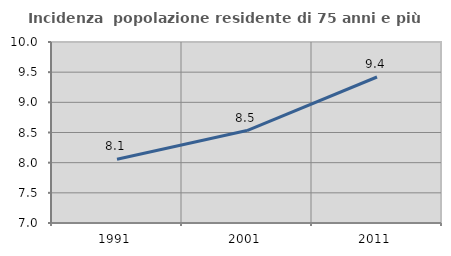
| Category | Incidenza  popolazione residente di 75 anni e più |
|---|---|
| 1991.0 | 8.058 |
| 2001.0 | 8.532 |
| 2011.0 | 9.42 |